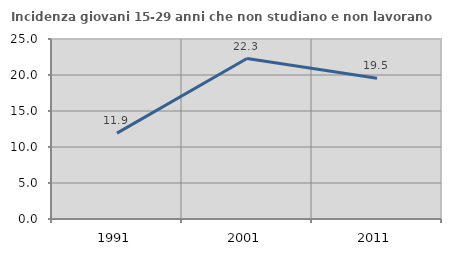
| Category | Incidenza giovani 15-29 anni che non studiano e non lavorano  |
|---|---|
| 1991.0 | 11.923 |
| 2001.0 | 22.282 |
| 2011.0 | 19.549 |